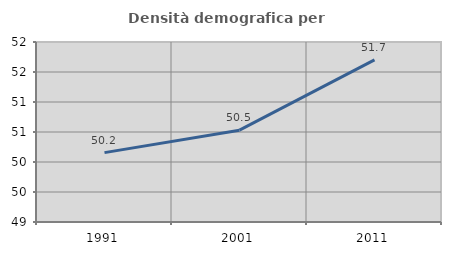
| Category | Densità demografica |
|---|---|
| 1991.0 | 50.156 |
| 2001.0 | 50.53 |
| 2011.0 | 51.703 |